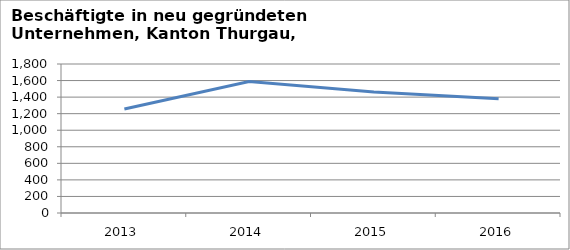
| Category | Sektoren 2 und 3 |
|---|---|
| 2013.0 | 1257 |
| 2014.0 | 1589 |
| 2015.0 | 1463 |
| 2016.0 | 1381 |